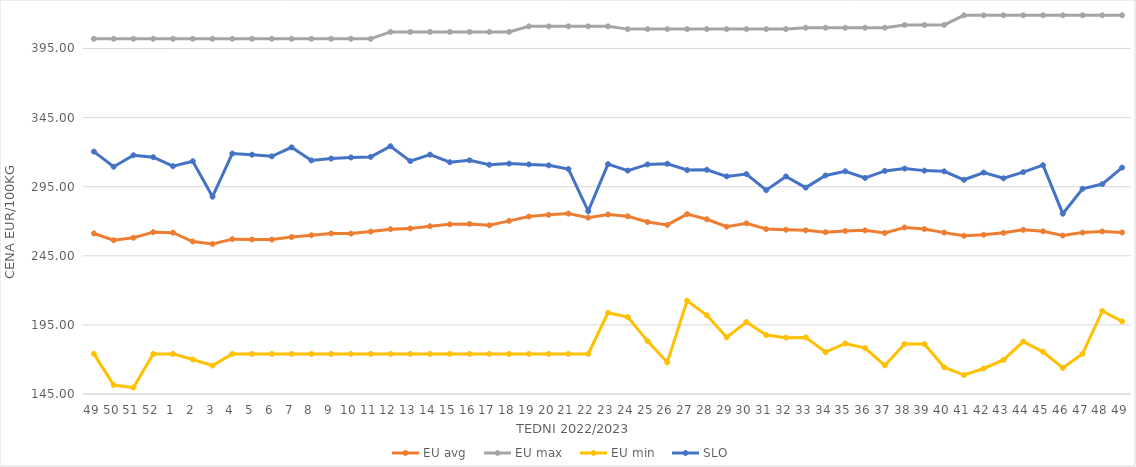
| Category | EU avg | EU max | EU min | SLO |
|---|---|---|---|---|
| 49.0 | 261.152 | 402 | 174 | 320.38 |
| 50.0 | 256.24 | 402 | 151.434 | 309.44 |
| 51.0 | 258.071 | 402 | 149.638 | 317.74 |
| 52.0 | 262.088 | 402 | 174 | 316.36 |
| 1.0 | 261.716 | 402 | 174 | 309.84 |
| 2.0 | 255.331 | 402 | 169.983 | 313.4 |
| 3.0 | 253.546 | 402 | 165.574 | 287.81 |
| 4.0 | 257.051 | 402 | 174 | 318.98 |
| 5.0 | 256.808 | 402 | 174 | 318.13 |
| 6.0 | 256.75 | 402 | 174 | 316.99 |
| 7.0 | 258.565 | 402 | 174 | 323.47 |
| 8.0 | 259.872 | 402 | 174 | 314 |
| 9.0 | 261.164 | 402 | 174 | 315.35 |
| 10.0 | 261.06 | 402 | 174 | 316.13 |
| 11.0 | 262.513 | 402 | 174 | 316.55 |
| 12.0 | 264.228 | 407 | 174 | 324.27 |
| 13.0 | 264.768 | 407 | 174 | 313.49 |
| 14.0 | 266.385 | 407 | 174 | 318.17 |
| 15.0 | 267.797 | 407 | 174 | 312.7 |
| 16.0 | 268.021 | 407 | 174 | 314.07 |
| 17.0 | 267.041 | 407 | 174 | 310.87 |
| 18.0 | 270.255 | 407 | 174 | 311.69 |
| 19.0 | 273.406 | 411 | 174 | 311.13 |
| 20.0 | 274.631 | 411 | 174 | 310.42 |
| 21.0 | 275.561 | 411 | 174 | 307.76 |
| 22.0 | 272.542 | 411 | 174 | 277.34 |
| 23.0 | 274.85 | 411 | 203.728 | 311.28 |
| 24.0 | 273.59 | 409 | 200.686 | 306.64 |
| 25.0 | 269.439 | 409 | 183.275 | 311.1 |
| 26.0 | 267.345 | 409 | 167.858 | 311.62 |
| 27.0 | 275.123 | 409 | 212.506 | 307.04 |
| 28.0 | 271.42 | 409 | 201.945 | 307.23 |
| 29.0 | 266.08 | 409 | 186.018 | 302.45 |
| 30.0 | 268.49 | 409 | 197.093 | 304.14 |
| 31.0 | 264.334 | 409 | 187.684 | 292.49 |
| 32.0 | 263.844 | 409 | 185.774 | 302.41 |
| 33.0 | 263.441 | 410 | 185.951 | 294.3 |
| 34.0 | 262.028 | 410 | 175.332 | 303.1 |
| 35.0 | 262.997 | 410 | 181.543 | 306.13 |
| 36.0 | 263.389 | 410 | 178.207 | 301.32 |
| 37.0 | 261.486 | 410 | 165.697 | 306.4 |
| 38.0 | 265.47 | 412 | 181.159 | 308.12 |
| 39.0 | 264.316 | 412 | 181.124 | 306.62 |
| 40.0 | 261.774 | 412 | 164.37 | 306.1 |
| 41.0 | 259.456 | 419 | 158.728 | 300 |
| 42.0 | 260.21 | 419 | 163.464 | 305.24 |
| 43.0 | 261.605 | 419 | 169.66 | 301.07 |
| 44.0 | 263.758 | 419 | 182.925 | 305.52 |
| 45.0 | 262.714 | 419 | 175.524 | 310.58 |
| 46.0 | 259.625 | 419 | 163.882 | 275.46 |
| 47.0 | 261.772 | 419 | 174.136 | 293.51 |
| 48.0 | 262.659 | 419 | 205.067 | 296.9 |
| 49.0 | 261.899 | 419 | 197.505 | 308.8 |